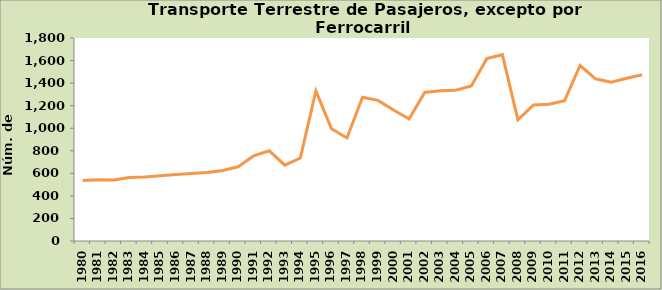
| Category | Series 0 |
|---|---|
| 1980.0 | 537 |
| 1981.0 | 543 |
| 1982.0 | 541 |
| 1983.0 | 563 |
| 1984.0 | 568 |
| 1985.0 | 579 |
| 1986.0 | 589 |
| 1987.0 | 599 |
| 1988.0 | 607 |
| 1989.0 | 625 |
| 1990.0 | 658 |
| 1991.0 | 755 |
| 1992.0 | 800 |
| 1993.0 | 672 |
| 1994.0 | 736 |
| 1995.0 | 1331 |
| 1996.0 | 996 |
| 1997.0 | 914 |
| 1998.0 | 1275 |
| 1999.0 | 1247 |
| 2000.0 | 1161 |
| 2001.0 | 1082 |
| 2002.0 | 1317 |
| 2003.0 | 1333 |
| 2004.0 | 1337 |
| 2005.0 | 1375 |
| 2006.0 | 1617 |
| 2007.0 | 1652 |
| 2008.0 | 1075 |
| 2009.0 | 1207 |
| 2010.0 | 1213 |
| 2011.0 | 1243 |
| 2012.0 | 1556 |
| 2013.0 | 1438 |
| 2014.0 | 1409 |
| 2015.0 | 1443 |
| 2016.0 | 1474 |